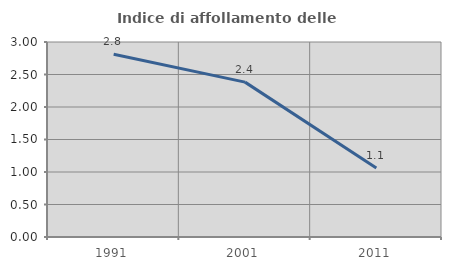
| Category | Indice di affollamento delle abitazioni  |
|---|---|
| 1991.0 | 2.812 |
| 2001.0 | 2.383 |
| 2011.0 | 1.061 |